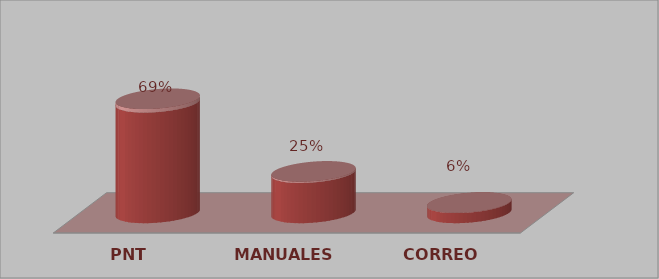
| Category | Series 0 | Series 1 |
|---|---|---|
| PNT | 22 | 0.688 |
| MANUALES | 8 | 0.25 |
| CORREO | 2 | 0.062 |